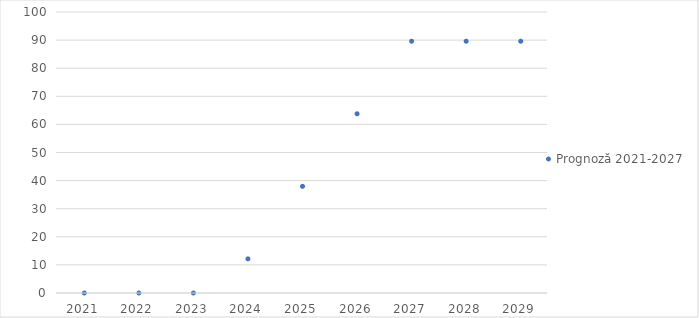
| Category | Prognoză 2021-2027 |
|---|---|
| 2021.0 | 0 |
| 2022.0 | 0 |
| 2023.0 | 0 |
| 2024.0 | 12.149 |
| 2025.0 | 37.965 |
| 2026.0 | 63.782 |
| 2027.0 | 89.598 |
| 2028.0 | 89.598 |
| 2029.0 | 89.598 |